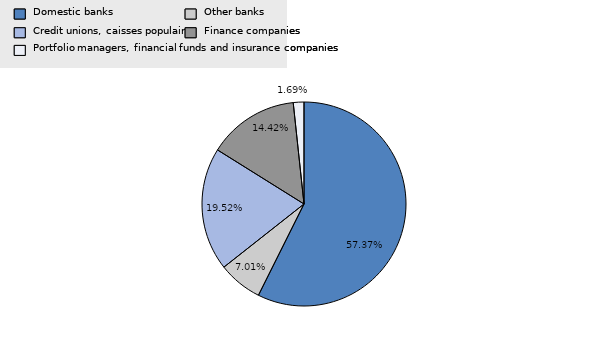
| Category | Series 0 |
|---|---|
| Domestic banks | 0.574 |
| Other banks | 0.07 |
| Credit unions, caisses populaires | 0.195 |
| Finance companies | 0.144 |
| Portfolio managers, financial funds and insurance companies | 0.017 |